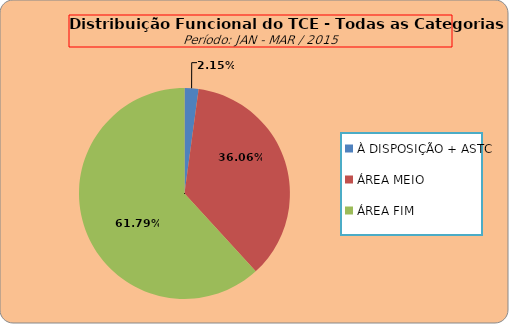
| Category | ÁREAS DE ATUAÇÃO |
|---|---|
| À DISPOSIÇÃO + ASTC | 11 |
| ÁREA MEIO | 185 |
| ÁREA FIM | 317 |